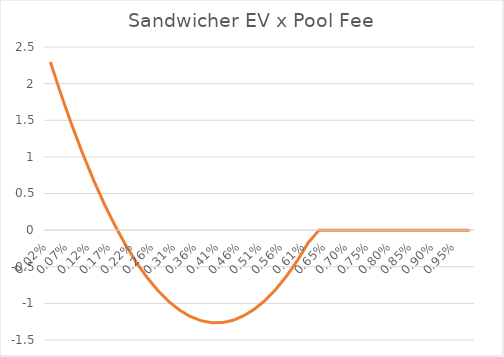
| Category | Searcher EV / User Volume  x Pool Fee |
|---|---|
| 0.0002 | 2.296 |
| 0.00044400000000000006 | 1.85 |
| 0.000688 | 1.433 |
| 0.0009320000000000001 | 1.046 |
| 0.0011760000000000002 | 0.69 |
| 0.0014200000000000003 | 0.362 |
| 0.0016640000000000003 | 0.065 |
| 0.0019080000000000004 | -0.202 |
| 0.0021520000000000003 | -0.439 |
| 0.002396 | -0.647 |
| 0.00264 | -0.825 |
| 0.002884 | -0.972 |
| 0.0031279999999999997 | -1.09 |
| 0.0033719999999999996 | -1.178 |
| 0.0036159999999999994 | -1.236 |
| 0.0038599999999999993 | -1.264 |
| 0.004103999999999999 | -1.262 |
| 0.0043479999999999994 | -1.231 |
| 0.004592 | -1.169 |
| 0.004836 | -1.077 |
| 0.00508 | -0.955 |
| 0.005324000000000001 | -0.804 |
| 0.005568000000000001 | -0.622 |
| 0.005812000000000001 | -0.411 |
| 0.0060560000000000015 | -0.169 |
| 0.006300000000000002 | 0 |
| 0.006544000000000002 | 0 |
| 0.006788000000000002 | 0 |
| 0.007032000000000003 | 0 |
| 0.007276000000000003 | 0 |
| 0.007520000000000003 | 0 |
| 0.0077640000000000035 | 0 |
| 0.008008000000000003 | 0 |
| 0.008252000000000002 | 0 |
| 0.008496000000000002 | 0 |
| 0.008740000000000001 | 0 |
| 0.008984 | 0 |
| 0.009228 | 0 |
| 0.009472 | 0 |
| 0.009715999999999999 | 0 |